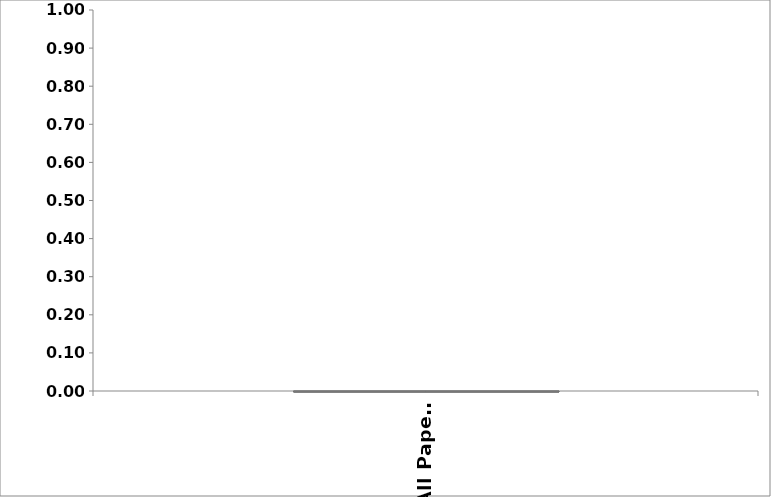
| Category | Series 0 | Series 3 |
|---|---|---|
| All Papers | 0 | 0 |